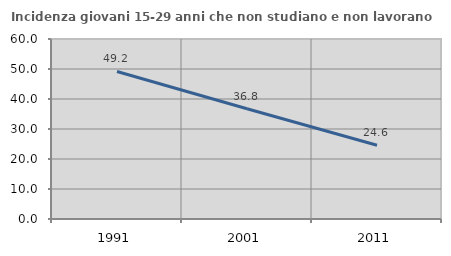
| Category | Incidenza giovani 15-29 anni che non studiano e non lavorano  |
|---|---|
| 1991.0 | 49.18 |
| 2001.0 | 36.765 |
| 2011.0 | 24.581 |